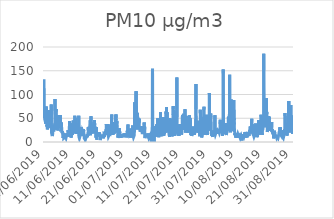
| Category | PM10 |
|---|---|
| 01/06/2019 | 132.3 |
| 01/06/2019 | 102.1 |
| 01/06/2019 | 87.3 |
| 01/06/2019 | 62.1 |
| 01/06/2019 | 53.3 |
| 01/06/2019 | 50.5 |
| 01/06/2019 | 57.1 |
| 01/06/2019 | 62.4 |
| 01/06/2019 | 73.5 |
| 01/06/2019 | 57.9 |
| 01/06/2019 | 46.1 |
| 01/06/2019 | 52.6 |
| 01/06/2019 | 38.8 |
| 01/06/2019 | 36.7 |
| 01/06/2019 | 43 |
| 01/06/2019 | 43.2 |
| 01/06/2019 | 40.1 |
| 01/06/2019 | 42.5 |
| 01/06/2019 | 53 |
| 01/06/2019 | 67.5 |
| 01/06/2019 | 74.9 |
| 01/06/2019 | 75 |
| 01/06/2019 | 54.7 |
| 01/06/2019 | 57.1 |
| 02/06/2019 | 43.9 |
| 02/06/2019 | 32.4 |
| 02/06/2019 | 31.8 |
| 02/06/2019 | 35.2 |
| 02/06/2019 | 31.3 |
| 02/06/2019 | 26.5 |
| 02/06/2019 | 27 |
| 02/06/2019 | 28.6 |
| 02/06/2019 | 30 |
| 02/06/2019 | 38.4 |
| 02/06/2019 | 37.2 |
| 02/06/2019 | 49.2 |
| 02/06/2019 | 38.3 |
| 02/06/2019 | 43.3 |
| 02/06/2019 | 54.2 |
| 02/06/2019 | 45.6 |
| 02/06/2019 | 55.1 |
| 02/06/2019 | 53.9 |
| 02/06/2019 | 50.5 |
| 02/06/2019 | 57.3 |
| 02/06/2019 | 67.3 |
| 02/06/2019 | 57.7 |
| 02/06/2019 | 51.8 |
| 02/06/2019 | 46.9 |
| 03/06/2019 | 37 |
| 03/06/2019 | 33.7 |
| 03/06/2019 | 33.9 |
| 03/06/2019 | 29.6 |
| 03/06/2019 | 28.3 |
| 03/06/2019 | 28.6 |
| 03/06/2019 | 37.1 |
| 03/06/2019 | 40.7 |
| 03/06/2019 | 50.6 |
| 03/06/2019 | 53.3 |
| 03/06/2019 | 55 |
| 03/06/2019 | 56.9 |
| 03/06/2019 | 66.3 |
| 03/06/2019 | 33.8 |
| 03/06/2019 | 40.7 |
| 03/06/2019 | 78.7 |
| 03/06/2019 | 42.7 |
| 03/06/2019 | 19.9 |
| 03/06/2019 | 18.2 |
| 03/06/2019 | 18.1 |
| 03/06/2019 | 17.1 |
| 03/06/2019 | 17 |
| 03/06/2019 | 18.9 |
| 03/06/2019 | 16.9 |
| 04/06/2019 | 15.3 |
| 04/06/2019 | 12.5 |
| 04/06/2019 | 12 |
| 04/06/2019 | 14.3 |
| 04/06/2019 | 17.2 |
| 04/06/2019 | 36.2 |
| 04/06/2019 | 38.3 |
| 04/06/2019 | 35 |
| 04/06/2019 | 35.5 |
| 04/06/2019 | 33.3 |
| 04/06/2019 | 27.3 |
| 04/06/2019 | 29.3 |
| 04/06/2019 | 31.8 |
| 04/06/2019 | 28.4 |
| 04/06/2019 | 22.4 |
| 04/06/2019 | 26.1 |
| 04/06/2019 | 26.2 |
| 04/06/2019 | 26.8 |
| 04/06/2019 | 25.8 |
| 04/06/2019 | 24.7 |
| 04/06/2019 | 35.4 |
| 04/06/2019 | 27.1 |
| 04/06/2019 | 31 |
| 04/06/2019 | 26.5 |
| 05/06/2019 | 40.7 |
| 05/06/2019 | 90.4 |
| 05/06/2019 | 58 |
| 05/06/2019 | 36.3 |
| 05/06/2019 | 39.2 |
| 05/06/2019 | 43.2 |
| 05/06/2019 | 50.3 |
| 05/06/2019 | 43.5 |
| 05/06/2019 | 43.4 |
| 05/06/2019 | 45.8 |
| 05/06/2019 | 47.2 |
| 05/06/2019 | 69.4 |
| 05/06/2019 | 63.5 |
| 05/06/2019 | 49.3 |
| 05/06/2019 | 56.3 |
| 05/06/2019 | 45.2 |
| 05/06/2019 | 35.7 |
| 05/06/2019 | 38 |
| 05/06/2019 | 29.9 |
| 05/06/2019 | 28 |
| 05/06/2019 | 26 |
| 05/06/2019 | 31 |
| 05/06/2019 | 32.5 |
| 05/06/2019 | 27.8 |
| 06/06/2019 | 24.3 |
| 06/06/2019 | 24.8 |
| 06/06/2019 | 24.2 |
| 06/06/2019 | 30.1 |
| 06/06/2019 | 33.2 |
| 06/06/2019 | 31.6 |
| 06/06/2019 | 37.3 |
| 06/06/2019 | 52 |
| 06/06/2019 | 45.5 |
| 06/06/2019 | 30.3 |
| 06/06/2019 | 31 |
| 06/06/2019 | 34.2 |
| 06/06/2019 | 37.7 |
| 06/06/2019 | 48.4 |
| 06/06/2019 | 56.7 |
| 06/06/2019 | 47.6 |
| 06/06/2019 | 43.7 |
| 06/06/2019 | 35.9 |
| 06/06/2019 | 32.2 |
| 06/06/2019 | 42 |
| 06/06/2019 | 43.3 |
| 06/06/2019 | 35 |
| 06/06/2019 | 34.3 |
| 06/06/2019 | 29.5 |
| 07/06/2019 | 30.8 |
| 07/06/2019 | 56.5 |
| 07/06/2019 | 36.3 |
| 07/06/2019 | 24.8 |
| 07/06/2019 | 22.4 |
| 07/06/2019 | 25.4 |
| 07/06/2019 | 33.3 |
| 07/06/2019 | 30.9 |
| 07/06/2019 | 36.4 |
| 07/06/2019 | 36.4 |
| 07/06/2019 | 41.2 |
| 07/06/2019 | 31.9 |
| 07/06/2019 | 27.1 |
| 07/06/2019 | 24.5 |
| 07/06/2019 | 22.8 |
| 07/06/2019 | 18.8 |
| 07/06/2019 | 18 |
| 07/06/2019 | 20.2 |
| 07/06/2019 | 22.6 |
| 07/06/2019 | 22.5 |
| 07/06/2019 | 20.7 |
| 07/06/2019 | 23 |
| 07/06/2019 | 16.8 |
| 07/06/2019 | 12.8 |
| 08/06/2019 | 8.5 |
| 08/06/2019 | 9 |
| 08/06/2019 | 8.9 |
| 08/06/2019 | 19.1 |
| 08/06/2019 | 13 |
| 08/06/2019 | 7.7 |
| 08/06/2019 | 8.3 |
| 08/06/2019 | 7.6 |
| 08/06/2019 | 6.8 |
| 08/06/2019 | 7.2 |
| 08/06/2019 | 7.3 |
| 08/06/2019 | 9.6 |
| 08/06/2019 | 9.1 |
| 08/06/2019 | 9.8 |
| 08/06/2019 | 9.6 |
| 08/06/2019 | 9.8 |
| 08/06/2019 | 12.3 |
| 08/06/2019 | 13.1 |
| 08/06/2019 | 12.4 |
| 08/06/2019 | 17.1 |
| 08/06/2019 | 14.7 |
| 08/06/2019 | 14.9 |
| 08/06/2019 | 11.5 |
| 08/06/2019 | 10.7 |
| 09/06/2019 | 11.3 |
| 09/06/2019 | 11.5 |
| 09/06/2019 | 8.9 |
| 09/06/2019 | 10 |
| 09/06/2019 | 10.2 |
| 09/06/2019 | 10 |
| 09/06/2019 | 13.3 |
| 09/06/2019 | 12.2 |
| 09/06/2019 | 14.1 |
| 09/06/2019 | 18.4 |
| 09/06/2019 | 16.4 |
| 09/06/2019 | 17.8 |
| 09/06/2019 | 13.7 |
| 09/06/2019 | 17.5 |
| 09/06/2019 | 16.2 |
| 09/06/2019 | 16 |
| 09/06/2019 | 15.8 |
| 09/06/2019 | 14 |
| 09/06/2019 | 14.4 |
| 09/06/2019 | 17.3 |
| 09/06/2019 | 24.9 |
| 09/06/2019 | 20.4 |
| 09/06/2019 | 21.6 |
| 09/06/2019 | 11.3 |
| 10/06/2019 | 10.7 |
| 10/06/2019 | 11.9 |
| 10/06/2019 | 12.6 |
| 10/06/2019 | 10.3 |
| 10/06/2019 | 9.8 |
| 10/06/2019 | 11.3 |
| 10/06/2019 | 19.6 |
| 10/06/2019 | 20.7 |
| 10/06/2019 | 19.3 |
| 10/06/2019 | 44 |
| 10/06/2019 | 22.8 |
| 10/06/2019 | 20.8 |
| 10/06/2019 | 18 |
| 10/06/2019 | 15.5 |
| 10/06/2019 | 19.8 |
| 10/06/2019 | 19.7 |
| 10/06/2019 | 16.6 |
| 10/06/2019 | 27.3 |
| 10/06/2019 | 26.1 |
| 10/06/2019 | 35.1 |
| 10/06/2019 | 30.2 |
| 10/06/2019 | 19.6 |
| 10/06/2019 | 16.5 |
| 10/06/2019 | 9.2 |
| 11/06/2019 | 13.5 |
| 11/06/2019 | 13.8 |
| 11/06/2019 | 14 |
| 11/06/2019 | 12.2 |
| 11/06/2019 | 14.5 |
| 11/06/2019 | 15.9 |
| 11/06/2019 | 20.1 |
| 11/06/2019 | 21.4 |
| 11/06/2019 | 29.1 |
| 11/06/2019 | 26.9 |
| 11/06/2019 | 39.3 |
| 11/06/2019 | 32.9 |
| 11/06/2019 | 15.4 |
| 11/06/2019 | 20.9 |
| 11/06/2019 | 23.8 |
| 11/06/2019 | 21.3 |
| 11/06/2019 | 36.8 |
| 11/06/2019 | 33.4 |
| 11/06/2019 | 45 |
| 11/06/2019 | 28.5 |
| 11/06/2019 | 39.6 |
| 11/06/2019 | 25.1 |
| 11/06/2019 | 18.9 |
| 11/06/2019 | 21.1 |
| 12/06/2019 | 21.9 |
| 12/06/2019 | 18.3 |
| 12/06/2019 | 17.6 |
| 12/06/2019 | 17.6 |
| 12/06/2019 | 17.4 |
| 12/06/2019 | 19.6 |
| 12/06/2019 | 28.5 |
| 12/06/2019 | 42.6 |
| 12/06/2019 | 55.1 |
| 12/06/2019 | 53.8 |
| 12/06/2019 | 39.5 |
| 12/06/2019 | 29.6 |
| 12/06/2019 | 34.4 |
| 12/06/2019 | 27.6 |
| 12/06/2019 | 36 |
| 12/06/2019 | 50.6 |
| 12/06/2019 | 27.9 |
| 12/06/2019 | 39.4 |
| 12/06/2019 | 35.1 |
| 12/06/2019 | 25.8 |
| 12/06/2019 | 30.4 |
| 12/06/2019 | 33.5 |
| 12/06/2019 | 28.5 |
| 12/06/2019 | 20 |
| 13/06/2019 | 16.9 |
| 13/06/2019 | 16.6 |
| 13/06/2019 | 23.1 |
| 13/06/2019 | 21.3 |
| 13/06/2019 | 23 |
| 13/06/2019 | 23 |
| 13/06/2019 | 25.5 |
| 13/06/2019 | 33.1 |
| 13/06/2019 | 33.2 |
| 13/06/2019 | 33.3 |
| 13/06/2019 | 29.4 |
| 13/06/2019 | 23.4 |
| 13/06/2019 | 23.8 |
| 13/06/2019 | 25.3 |
| 13/06/2019 | 23.1 |
| 13/06/2019 | 20.5 |
| 13/06/2019 | 22.3 |
| 13/06/2019 | 23.8 |
| 13/06/2019 | 30.2 |
| 13/06/2019 | 55.5 |
| 13/06/2019 | 12.3 |
| 13/06/2019 | 9.8 |
| 13/06/2019 | 10 |
| 13/06/2019 | 11.3 |
| 14/06/2019 | 7.6 |
| 14/06/2019 | 7.8 |
| 14/06/2019 | 7.9 |
| 14/06/2019 | 7.8 |
| 14/06/2019 | 10.6 |
| 14/06/2019 | 14 |
| 14/06/2019 | 16.1 |
| 14/06/2019 | 22.4 |
| 14/06/2019 | 12.6 |
| 14/06/2019 | 14.4 |
| 14/06/2019 | 15.4 |
| 14/06/2019 | 26.7 |
| 14/06/2019 | 27 |
| 14/06/2019 | 24.2 |
| 14/06/2019 | 29 |
| 14/06/2019 | 22.2 |
| 14/06/2019 | 25.5 |
| 14/06/2019 | 31.1 |
| 14/06/2019 | 13.8 |
| 14/06/2019 | 17.6 |
| 14/06/2019 | 14.6 |
| 14/06/2019 | 16.7 |
| 14/06/2019 | 16 |
| 14/06/2019 | 14.3 |
| 15/06/2019 | 16.8 |
| 15/06/2019 | 17.1 |
| 15/06/2019 | 17.8 |
| 15/06/2019 | 21.3 |
| 15/06/2019 | 23.9 |
| 15/06/2019 | 23.6 |
| 15/06/2019 | 22.2 |
| 15/06/2019 | 24.1 |
| 15/06/2019 | 23.8 |
| 15/06/2019 | 25.6 |
| 15/06/2019 | 22.8 |
| 15/06/2019 | 21.9 |
| 15/06/2019 | 19.8 |
| 15/06/2019 | 27.1 |
| 15/06/2019 | 23 |
| 15/06/2019 | 19.4 |
| 15/06/2019 | 16.9 |
| 15/06/2019 | 12.8 |
| 15/06/2019 | 10.5 |
| 15/06/2019 | 7.7 |
| 15/06/2019 | 7.1 |
| 15/06/2019 | 8.3 |
| 15/06/2019 | 7.9 |
| 15/06/2019 | 8.1 |
| 16/06/2019 | 7 |
| 16/06/2019 | 6.9 |
| 16/06/2019 | 6.1 |
| 16/06/2019 | 4.9 |
| 16/06/2019 | 4 |
| 16/06/2019 | 6 |
| 16/06/2019 | 9.4 |
| 16/06/2019 | 6.8 |
| 16/06/2019 | 8.7 |
| 16/06/2019 | 7.3 |
| 16/06/2019 | 8.4 |
| 16/06/2019 | 7.9 |
| 16/06/2019 | 8.5 |
| 16/06/2019 | 8.8 |
| 16/06/2019 | 10.2 |
| 16/06/2019 | 9.9 |
| 16/06/2019 | 10.9 |
| 16/06/2019 | 13.3 |
| 16/06/2019 | 12.3 |
| 16/06/2019 | 12.5 |
| 16/06/2019 | 13.9 |
| 16/06/2019 | 16.1 |
| 16/06/2019 | 17.8 |
| 16/06/2019 | 12.3 |
| 17/06/2019 | 10.1 |
| 17/06/2019 | 11.4 |
| 17/06/2019 | 16.1 |
| 17/06/2019 | 14.7 |
| 17/06/2019 | 13.7 |
| 17/06/2019 | 17.9 |
| 17/06/2019 | 31.1 |
| 17/06/2019 | 31.4 |
| 17/06/2019 | 22.5 |
| 17/06/2019 | 16.2 |
| 17/06/2019 | 15.7 |
| 17/06/2019 | 19.4 |
| 17/06/2019 | 26.9 |
| 17/06/2019 | 26.4 |
| 17/06/2019 | 23.7 |
| 17/06/2019 | 25.7 |
| 17/06/2019 | 32.1 |
| 17/06/2019 | 27 |
| 17/06/2019 | 22.7 |
| 17/06/2019 | 28 |
| 17/06/2019 | 28.7 |
| 17/06/2019 | 28.9 |
| 17/06/2019 | 33.1 |
| 17/06/2019 | 36.9 |
| 18/06/2019 | 45.8 |
| 18/06/2019 | 23.1 |
| 18/06/2019 | 14.4 |
| 18/06/2019 | 22.5 |
| 18/06/2019 | 18 |
| 18/06/2019 | 21.5 |
| 18/06/2019 | 41.1 |
| 18/06/2019 | 54.2 |
| 18/06/2019 | 37.9 |
| 18/06/2019 | 30.6 |
| 18/06/2019 | 26.9 |
| 18/06/2019 | 27.3 |
| 18/06/2019 | 27.6 |
| 18/06/2019 | 30.8 |
| 18/06/2019 | 32.2 |
| 18/06/2019 | 21.2 |
| 18/06/2019 | 20.9 |
| 18/06/2019 | 23.7 |
| 18/06/2019 | 26.2 |
| 18/06/2019 | 32.7 |
| 18/06/2019 | 36.6 |
| 18/06/2019 | 38.5 |
| 18/06/2019 | 28 |
| 18/06/2019 | 30.4 |
| 19/06/2019 | 26.3 |
| 19/06/2019 | 27.6 |
| 19/06/2019 | 20.4 |
| 19/06/2019 | 19.2 |
| 19/06/2019 | 18.9 |
| 19/06/2019 | 18.1 |
| 19/06/2019 | 27.8 |
| 19/06/2019 | 36.7 |
| 19/06/2019 | 29.3 |
| 19/06/2019 | 29.5 |
| 19/06/2019 | 38.7 |
| 19/06/2019 | 33.9 |
| 19/06/2019 | 35.2 |
| 19/06/2019 | 32.4 |
| 19/06/2019 | 46.1 |
| 19/06/2019 | 35.7 |
| 19/06/2019 | 31 |
| 19/06/2019 | 30.1 |
| 19/06/2019 | 26.1 |
| 19/06/2019 | 21.7 |
| 19/06/2019 | 22.4 |
| 19/06/2019 | 28.7 |
| 19/06/2019 | 31.9 |
| 19/06/2019 | 27 |
| 20/06/2019 | 14.9 |
| 20/06/2019 | 13.9 |
| 20/06/2019 | 11.4 |
| 20/06/2019 | 9 |
| 20/06/2019 | 11 |
| 20/06/2019 | 15.6 |
| 20/06/2019 | 31.3 |
| 20/06/2019 | 13.8 |
| 20/06/2019 | 8.5 |
| 20/06/2019 | 6.4 |
| 20/06/2019 | 4.8 |
| 20/06/2019 | 7 |
| 20/06/2019 | 8.6 |
| 20/06/2019 | 8.4 |
| 20/06/2019 | 11.7 |
| 20/06/2019 | 14.6 |
| 20/06/2019 | 14.6 |
| 20/06/2019 | 13.6 |
| 20/06/2019 | 16.1 |
| 20/06/2019 | 14.6 |
| 20/06/2019 | 14.4 |
| 20/06/2019 | 19.8 |
| 20/06/2019 | 14.4 |
| 20/06/2019 | 11.8 |
| 21/06/2019 | 9.8 |
| 21/06/2019 | 11.1 |
| 21/06/2019 | 12.1 |
| 21/06/2019 | 12 |
| 21/06/2019 | 19.7 |
| 21/06/2019 | 18.7 |
| 21/06/2019 | 16.7 |
| 21/06/2019 | 17.6 |
| 21/06/2019 | 14 |
| 21/06/2019 | 14.4 |
| 21/06/2019 | 19.9 |
| 21/06/2019 | 17.9 |
| 21/06/2019 | 15.1 |
| 21/06/2019 | 12.8 |
| 21/06/2019 | 14.7 |
| 21/06/2019 | 11.6 |
| 21/06/2019 | 9.9 |
| 21/06/2019 | 4 |
| 21/06/2019 | 5.1 |
| 21/06/2019 | 7.8 |
| 21/06/2019 | 12.5 |
| 21/06/2019 | 12.6 |
| 21/06/2019 | 9.9 |
| 21/06/2019 | 10.6 |
| 22/06/2019 | 10.1 |
| 22/06/2019 | 9.4 |
| 22/06/2019 | 10.6 |
| 22/06/2019 | 10.9 |
| 22/06/2019 | 9 |
| 22/06/2019 | 9.3 |
| 22/06/2019 | 8.5 |
| 22/06/2019 | 10.1 |
| 22/06/2019 | 9.1 |
| 22/06/2019 | 7.9 |
| 22/06/2019 | 10.6 |
| 22/06/2019 | 15.6 |
| 22/06/2019 | 11.5 |
| 22/06/2019 | 14.1 |
| 22/06/2019 | 14 |
| 22/06/2019 | 10.5 |
| 22/06/2019 | 12.2 |
| 22/06/2019 | 13.9 |
| 22/06/2019 | 11.6 |
| 22/06/2019 | 10.9 |
| 22/06/2019 | 8 |
| 22/06/2019 | 7.1 |
| 22/06/2019 | 8.7 |
| 22/06/2019 | 11.3 |
| 23/06/2019 | 14 |
| 23/06/2019 | 17.3 |
| 23/06/2019 | 17.4 |
| 23/06/2019 | 17.2 |
| 23/06/2019 | 18.7 |
| 23/06/2019 | 18.4 |
| 23/06/2019 | 17.9 |
| 23/06/2019 | 18.2 |
| 23/06/2019 | 16.7 |
| 23/06/2019 | 17 |
| 23/06/2019 | 15.5 |
| 23/06/2019 | 14.2 |
| 23/06/2019 | 15.6 |
| 23/06/2019 | 18.2 |
| 23/06/2019 | 18.7 |
| 23/06/2019 | 18.6 |
| 23/06/2019 | 23.4 |
| 23/06/2019 | 20.3 |
| 23/06/2019 | 18.1 |
| 23/06/2019 | 18.6 |
| 23/06/2019 | 26.8 |
| 23/06/2019 | 29.2 |
| 23/06/2019 | 37.4 |
| 23/06/2019 | 33.6 |
| 24/06/2019 | 35.8 |
| 24/06/2019 | 18.8 |
| 24/06/2019 | 15.1 |
| 24/06/2019 | 15.2 |
| 24/06/2019 | 16.1 |
| 24/06/2019 | 15.2 |
| 24/06/2019 | 20 |
| 24/06/2019 | 26.9 |
| 24/06/2019 | 26.5 |
| 24/06/2019 | 32.6 |
| 24/06/2019 | 22.9 |
| 24/06/2019 | 28.3 |
| 24/06/2019 | 24.5 |
| 24/06/2019 | 37.6 |
| 24/06/2019 | 17.9 |
| 24/06/2019 | 15.1 |
| 24/06/2019 | 13.6 |
| 24/06/2019 | 11.5 |
| 24/06/2019 | 10.1 |
| 24/06/2019 | 11.3 |
| 24/06/2019 | 11 |
| 24/06/2019 | 10.9 |
| 24/06/2019 | 11.9 |
| 24/06/2019 | 13.6 |
| 25/06/2019 | 15 |
| 25/06/2019 | 14.6 |
| 25/06/2019 | 14.3 |
| 25/06/2019 | 13 |
| 25/06/2019 | 12.6 |
| 25/06/2019 | 12.4 |
| 25/06/2019 | 13.7 |
| 25/06/2019 | 14.6 |
| 25/06/2019 | 21.3 |
| 25/06/2019 | 22 |
| 25/06/2019 | 20.1 |
| 25/06/2019 | 24.8 |
| 25/06/2019 | 20.4 |
| 25/06/2019 | 24.8 |
| 25/06/2019 | 34.9 |
| 25/06/2019 | 20.3 |
| 25/06/2019 | 18.3 |
| 25/06/2019 | 17.7 |
| 25/06/2019 | 26.5 |
| 25/06/2019 | 27.4 |
| 25/06/2019 | 36.4 |
| 25/06/2019 | 57.7 |
| 25/06/2019 | 45.5 |
| 25/06/2019 | 31 |
| 26/06/2019 | 34.3 |
| 26/06/2019 | 27.7 |
| 26/06/2019 | 14.8 |
| 26/06/2019 | 15.6 |
| 26/06/2019 | 25.7 |
| 26/06/2019 | 15 |
| 26/06/2019 | 21.3 |
| 26/06/2019 | 26.3 |
| 26/06/2019 | 35.4 |
| 26/06/2019 | 25.8 |
| 26/06/2019 | 19.6 |
| 26/06/2019 | 17.5 |
| 26/06/2019 | 19.2 |
| 26/06/2019 | 16 |
| 26/06/2019 | 17.6 |
| 26/06/2019 | 24.3 |
| 26/06/2019 | 19.9 |
| 26/06/2019 | 16.7 |
| 26/06/2019 | 23.2 |
| 26/06/2019 | 31.7 |
| 26/06/2019 | 35.9 |
| 26/06/2019 | 41.8 |
| 26/06/2019 | 37.2 |
| 26/06/2019 | 36.2 |
| 27/06/2019 | 30.5 |
| 27/06/2019 | 22.3 |
| 27/06/2019 | 23.9 |
| 27/06/2019 | 19.2 |
| 27/06/2019 | 24.4 |
| 27/06/2019 | 26.8 |
| 27/06/2019 | 31.4 |
| 27/06/2019 | 36.9 |
| 27/06/2019 | 55 |
| 27/06/2019 | 51 |
| 27/06/2019 | 52.5 |
| 27/06/2019 | 58 |
| 27/06/2019 | 57.7 |
| 27/06/2019 | 45.7 |
| 27/06/2019 | 43 |
| 27/06/2019 | 35.5 |
| 27/06/2019 | 29.7 |
| 27/06/2019 | 32.2 |
| 27/06/2019 | 35.3 |
| 27/06/2019 | 44.4 |
| 27/06/2019 | 38.9 |
| 27/06/2019 | 38.6 |
| 27/06/2019 | 33.6 |
| 27/06/2019 | 28.3 |
| 28/06/2019 | 24.6 |
| 28/06/2019 | 23 |
| 28/06/2019 | 20.9 |
| 28/06/2019 | 9.1 |
| 28/06/2019 | 10.9 |
| 28/06/2019 | 8.6 |
| 28/06/2019 | 9.2 |
| 28/06/2019 | 11.3 |
| 28/06/2019 | 15.3 |
| 28/06/2019 | 18.7 |
| 28/06/2019 | 14.5 |
| 28/06/2019 | 18 |
| 28/06/2019 | 19.7 |
| 28/06/2019 | 17.3 |
| 28/06/2019 | 25.3 |
| 28/06/2019 | 27.1 |
| 28/06/2019 | 29.4 |
| 28/06/2019 | 18.1 |
| 28/06/2019 | 15.9 |
| 28/06/2019 | 17.7 |
| 28/06/2019 | 21.9 |
| 28/06/2019 | 21 |
| 28/06/2019 | 16.9 |
| 28/06/2019 | 18.4 |
| 29/06/2019 | 14 |
| 29/06/2019 | 14.2 |
| 29/06/2019 | 15.8 |
| 29/06/2019 | 13.2 |
| 29/06/2019 | 9.6 |
| 29/06/2019 | 11.8 |
| 29/06/2019 | 9.7 |
| 29/06/2019 | 9.4 |
| 29/06/2019 | 11.5 |
| 29/06/2019 | 14.5 |
| 29/06/2019 | 16.8 |
| 29/06/2019 | 15.4 |
| 29/06/2019 | 14.7 |
| 29/06/2019 | 12 |
| 29/06/2019 | 12.7 |
| 29/06/2019 | 11 |
| 29/06/2019 | 10.3 |
| 29/06/2019 | 13 |
| 29/06/2019 | 13.4 |
| 29/06/2019 | 13.3 |
| 29/06/2019 | 10.9 |
| 29/06/2019 | 12 |
| 29/06/2019 | 12.4 |
| 29/06/2019 | 12.1 |
| 30/06/2019 | 16 |
| 30/06/2019 | 10.7 |
| 30/06/2019 | 11.1 |
| 30/06/2019 | 11.4 |
| 30/06/2019 | 11.2 |
| 30/06/2019 | 11.6 |
| 30/06/2019 | 10.2 |
| 30/06/2019 | 10.4 |
| 30/06/2019 | 17.2 |
| 30/06/2019 | 17.4 |
| 30/06/2019 | 18.6 |
| 30/06/2019 | 17.9 |
| 30/06/2019 | 13.6 |
| 30/06/2019 | 13.9 |
| 30/06/2019 | 12.1 |
| 30/06/2019 | 12.3 |
| 30/06/2019 | 17.6 |
| 30/06/2019 | 14.3 |
| 30/06/2019 | 14.9 |
| 30/06/2019 | 17.6 |
| 30/06/2019 | 14.7 |
| 30/06/2019 | 12.3 |
| 30/06/2019 | 12.9 |
| 30/06/2019 | 12.6 |
| 01/07/2019 | 13.5 |
| 01/07/2019 | 13.8 |
| 01/07/2019 | 14.1 |
| 01/07/2019 | 13.3 |
| 01/07/2019 | 11.3 |
| 01/07/2019 | 12.5 |
| 01/07/2019 | 12 |
| 01/07/2019 | 15.8 |
| 01/07/2019 | 17.8 |
| 01/07/2019 | 16.8 |
| 01/07/2019 | 16.1 |
| 01/07/2019 | 14.5 |
| 01/07/2019 | 16.5 |
| 01/07/2019 | 16.9 |
| 01/07/2019 | 18.6 |
| 01/07/2019 | 23.7 |
| 01/07/2019 | 20.6 |
| 01/07/2019 | 20.6 |
| 01/07/2019 | 21.9 |
| 01/07/2019 | 24.5 |
| 01/07/2019 | 30.9 |
| 01/07/2019 | 36.9 |
| 01/07/2019 | 13.2 |
| 01/07/2019 | 16 |
| 02/07/2019 | 15.6 |
| 02/07/2019 | 14.9 |
| 02/07/2019 | 14.6 |
| 02/07/2019 | 14 |
| 02/07/2019 | 16.2 |
| 02/07/2019 | 15.7 |
| 02/07/2019 | 16.4 |
| 02/07/2019 | 10.4 |
| 02/07/2019 | 14.8 |
| 02/07/2019 | 12.8 |
| 02/07/2019 | 14.5 |
| 02/07/2019 | 12.2 |
| 02/07/2019 | 11.8 |
| 02/07/2019 | 14 |
| 02/07/2019 | 13.9 |
| 02/07/2019 | 12.2 |
| 02/07/2019 | 12.3 |
| 02/07/2019 | 13.9 |
| 02/07/2019 | 12.2 |
| 02/07/2019 | 13 |
| 02/07/2019 | 13.6 |
| 02/07/2019 | 28.6 |
| 02/07/2019 | 26.7 |
| 02/07/2019 | 11 |
| 03/07/2019 | 13.3 |
| 03/07/2019 | 13.7 |
| 03/07/2019 | 11.9 |
| 03/07/2019 | 9.4 |
| 03/07/2019 | 9.9 |
| 03/07/2019 | 9.4 |
| 03/07/2019 | 13.1 |
| 03/07/2019 | 15.4 |
| 03/07/2019 | 18.6 |
| 03/07/2019 | 18.1 |
| 03/07/2019 | 15.7 |
| 03/07/2019 | 27.6 |
| 03/07/2019 | 22.7 |
| 03/07/2019 | 25.3 |
| 03/07/2019 | 34.9 |
| 03/07/2019 | 30.6 |
| 03/07/2019 | 29.5 |
| 03/07/2019 | 22.8 |
| 03/07/2019 | 14.2 |
| 03/07/2019 | 13.4 |
| 03/07/2019 | 12.4 |
| 03/07/2019 | 12.8 |
| 03/07/2019 | 10.1 |
| 03/07/2019 | 9.7 |
| 04/07/2019 | 10.4 |
| 04/07/2019 | 9.3 |
| 04/07/2019 | 11.4 |
| 04/07/2019 | 9.3 |
| 04/07/2019 | 10.2 |
| 04/07/2019 | 14.6 |
| 04/07/2019 | 22.4 |
| 04/07/2019 | 28.8 |
| 04/07/2019 | 30.5 |
| 04/07/2019 | 83.8 |
| 04/07/2019 | 31.2 |
| 04/07/2019 | 29.1 |
| 04/07/2019 | 31.7 |
| 04/07/2019 | 31.2 |
| 04/07/2019 | 35.6 |
| 04/07/2019 | 44.3 |
| 04/07/2019 | 38.6 |
| 04/07/2019 | 32.1 |
| 04/07/2019 | 39.2 |
| 04/07/2019 | 60.4 |
| 04/07/2019 | 29.3 |
| 04/07/2019 | 106.7 |
| 04/07/2019 | 34.8 |
| 04/07/2019 | 75.1 |
| 05/07/2019 | 74.8 |
| 05/07/2019 | 39.5 |
| 05/07/2019 | 54.3 |
| 05/07/2019 | 35.1 |
| 05/07/2019 | 61.6 |
| 05/07/2019 | 41.9 |
| 05/07/2019 | 26.1 |
| 05/07/2019 | 41.5 |
| 05/07/2019 | 42.8 |
| 05/07/2019 | 45.5 |
| 05/07/2019 | 61.1 |
| 05/07/2019 | 42.5 |
| 05/07/2019 | 42.7 |
| 05/07/2019 | 48.9 |
| 05/07/2019 | 47.8 |
| 05/07/2019 | 48.6 |
| 05/07/2019 | 42.3 |
| 05/07/2019 | 46.6 |
| 05/07/2019 | 42.3 |
| 05/07/2019 | 38.3 |
| 05/07/2019 | 49.2 |
| 05/07/2019 | 39.7 |
| 05/07/2019 | 40.8 |
| 05/07/2019 | 48.9 |
| 06/07/2019 | 46.7 |
| 06/07/2019 | 36.7 |
| 06/07/2019 | 33.3 |
| 06/07/2019 | 30 |
| 06/07/2019 | 28.6 |
| 06/07/2019 | 26.6 |
| 06/07/2019 | 30.5 |
| 06/07/2019 | 28 |
| 06/07/2019 | 29.7 |
| 06/07/2019 | 21.5 |
| 06/07/2019 | 21.2 |
| 06/07/2019 | 19.5 |
| 06/07/2019 | 23.4 |
| 06/07/2019 | 27.6 |
| 06/07/2019 | 32.6 |
| 06/07/2019 | 29.2 |
| 06/07/2019 | 33.3 |
| 06/07/2019 | 34.2 |
| 06/07/2019 | 32.1 |
| 06/07/2019 | 25.2 |
| 06/07/2019 | 31.5 |
| 06/07/2019 | 26.1 |
| 06/07/2019 | 29.5 |
| 06/07/2019 | 28.8 |
| 07/07/2019 | 26.5 |
| 07/07/2019 | 21.3 |
| 07/07/2019 | 22.4 |
| 07/07/2019 | 19.4 |
| 07/07/2019 | 16.6 |
| 07/07/2019 | 17.7 |
| 07/07/2019 | 18.5 |
| 07/07/2019 | 20.1 |
| 07/07/2019 | 22.5 |
| 07/07/2019 | 19.8 |
| 07/07/2019 | 24.7 |
| 07/07/2019 | 25.2 |
| 07/07/2019 | 29.3 |
| 07/07/2019 | 24.2 |
| 07/07/2019 | 24.6 |
| 07/07/2019 | 29.6 |
| 07/07/2019 | 26.2 |
| 07/07/2019 | 29.9 |
| 07/07/2019 | 28 |
| 07/07/2019 | 29.5 |
| 07/07/2019 | 41.2 |
| 07/07/2019 | 36 |
| 07/07/2019 | 30.1 |
| 07/07/2019 | 20.2 |
| 08/07/2019 | 33.9 |
| 08/07/2019 | 26.2 |
| 08/07/2019 | 10.7 |
| 08/07/2019 | 8.2 |
| 08/07/2019 | 8.7 |
| 08/07/2019 | 10.4 |
| 08/07/2019 | 12.5 |
| 08/07/2019 | 13.6 |
| 08/07/2019 | 11.6 |
| 08/07/2019 | 10.9 |
| 08/07/2019 | 12.7 |
| 08/07/2019 | 14.1 |
| 08/07/2019 | 13.5 |
| 08/07/2019 | 12.7 |
| 08/07/2019 | 12.9 |
| 08/07/2019 | 13.8 |
| 08/07/2019 | 17.7 |
| 08/07/2019 | 16 |
| 08/07/2019 | 14.1 |
| 08/07/2019 | 14.2 |
| 08/07/2019 | 15 |
| 08/07/2019 | 13.8 |
| 08/07/2019 | 14.1 |
| 08/07/2019 | 14.1 |
| 09/07/2019 | 14.6 |
| 09/07/2019 | 14.2 |
| 09/07/2019 | 13.3 |
| 09/07/2019 | 12.6 |
| 09/07/2019 | 13.1 |
| 09/07/2019 | 13.1 |
| 09/07/2019 | 15.8 |
| 09/07/2019 | 18 |
| 09/07/2019 | 17.5 |
| 09/07/2019 | 15.2 |
| 09/07/2019 | 8.1 |
| 09/07/2019 | 11.1 |
| 09/07/2019 | 10.9 |
| 09/07/2019 | 9.8 |
| 09/07/2019 | 8.1 |
| 09/07/2019 | 6.7 |
| 09/07/2019 | 6.4 |
| 09/07/2019 | 6.8 |
| 09/07/2019 | 8.2 |
| 09/07/2019 | 11.5 |
| 09/07/2019 | 12.5 |
| 09/07/2019 | 14.5 |
| 09/07/2019 | 17.3 |
| 09/07/2019 | 14.1 |
| 10/07/2019 | 10.2 |
| 10/07/2019 | 15 |
| 10/07/2019 | 17 |
| 10/07/2019 | 17 |
| 10/07/2019 | 15.3 |
| 10/07/2019 | 16.2 |
| 10/07/2019 | 16.1 |
| 10/07/2019 | 17.3 |
| 10/07/2019 | 18.1 |
| 10/07/2019 | 16.8 |
| 10/07/2019 | 15 |
| 10/07/2019 | 13.8 |
| 10/07/2019 | 13.8 |
| 10/07/2019 | 13.8 |
| 10/07/2019 | 0 |
| 10/07/2019 | 0 |
| 10/07/2019 | 0 |
| 10/07/2019 | 17.4 |
| 10/07/2019 | 18.5 |
| 10/07/2019 | 14.8 |
| 10/07/2019 | 31 |
| 10/07/2019 | 142.8 |
| 10/07/2019 | 154.1 |
| 10/07/2019 | 18.6 |
| 11/07/2019 | 17.3 |
| 11/07/2019 | 15 |
| 11/07/2019 | 16.7 |
| 11/07/2019 | 17.3 |
| 11/07/2019 | 14.5 |
| 11/07/2019 | 15.4 |
| 11/07/2019 | 16 |
| 11/07/2019 | 18.2 |
| 11/07/2019 | 22.9 |
| 11/07/2019 | 22.3 |
| 11/07/2019 | 25.5 |
| 11/07/2019 | 0 |
| 11/07/2019 | 23.9 |
| 11/07/2019 | 26.6 |
| 11/07/2019 | 25.6 |
| 11/07/2019 | 28.5 |
| 11/07/2019 | 25.9 |
| 11/07/2019 | 17.5 |
| 11/07/2019 | 24.1 |
| 11/07/2019 | 29.2 |
| 11/07/2019 | 19.7 |
| 11/07/2019 | 33.2 |
| 11/07/2019 | 24.6 |
| 11/07/2019 | 17.6 |
| 12/07/2019 | 14.4 |
| 12/07/2019 | 13.8 |
| 12/07/2019 | 11.4 |
| 12/07/2019 | 11.6 |
| 12/07/2019 | 15 |
| 12/07/2019 | 20.6 |
| 12/07/2019 | 23.4 |
| 12/07/2019 | 21.4 |
| 12/07/2019 | 28.8 |
| 12/07/2019 | 26.7 |
| 12/07/2019 | 36.8 |
| 12/07/2019 | 26.6 |
| 12/07/2019 | 34.7 |
| 12/07/2019 | 22.6 |
| 12/07/2019 | 25.4 |
| 12/07/2019 | 24.7 |
| 12/07/2019 | 36.4 |
| 12/07/2019 | 30.1 |
| 12/07/2019 | 23.5 |
| 12/07/2019 | 19.7 |
| 12/07/2019 | 50.1 |
| 12/07/2019 | 29.6 |
| 12/07/2019 | 20.1 |
| 12/07/2019 | 18.9 |
| 13/07/2019 | 14.7 |
| 13/07/2019 | 19 |
| 13/07/2019 | 17.5 |
| 13/07/2019 | 15.7 |
| 13/07/2019 | 14.6 |
| 13/07/2019 | 10 |
| 13/07/2019 | 24.6 |
| 13/07/2019 | 17.2 |
| 13/07/2019 | 21.3 |
| 13/07/2019 | 27.4 |
| 13/07/2019 | 20.8 |
| 13/07/2019 | 24.1 |
| 13/07/2019 | 21.4 |
| 13/07/2019 | 25.9 |
| 13/07/2019 | 19 |
| 13/07/2019 | 21.9 |
| 13/07/2019 | 27.8 |
| 13/07/2019 | 23.6 |
| 13/07/2019 | 18 |
| 13/07/2019 | 18 |
| 13/07/2019 | 31.5 |
| 13/07/2019 | 62.5 |
| 13/07/2019 | 33.3 |
| 13/07/2019 | 17.3 |
| 14/07/2019 | 21 |
| 14/07/2019 | 22.3 |
| 14/07/2019 | 18.5 |
| 14/07/2019 | 14.6 |
| 14/07/2019 | 17 |
| 14/07/2019 | 17.9 |
| 14/07/2019 | 18.1 |
| 14/07/2019 | 16.9 |
| 14/07/2019 | 12.2 |
| 14/07/2019 | 14.8 |
| 14/07/2019 | 14.4 |
| 14/07/2019 | 17.2 |
| 14/07/2019 | 12.6 |
| 14/07/2019 | 19.5 |
| 14/07/2019 | 36.1 |
| 14/07/2019 | 22.5 |
| 14/07/2019 | 14.8 |
| 14/07/2019 | 16.3 |
| 14/07/2019 | 13.9 |
| 14/07/2019 | 17.8 |
| 14/07/2019 | 36.6 |
| 14/07/2019 | 45 |
| 14/07/2019 | 52 |
| 14/07/2019 | 33.8 |
| 15/07/2019 | 16.6 |
| 15/07/2019 | 13.2 |
| 15/07/2019 | 11.7 |
| 15/07/2019 | 12 |
| 15/07/2019 | 14.8 |
| 15/07/2019 | 21.5 |
| 15/07/2019 | 17 |
| 15/07/2019 | 15.8 |
| 15/07/2019 | 19.4 |
| 15/07/2019 | 17.8 |
| 15/07/2019 | 19.5 |
| 15/07/2019 | 21.6 |
| 15/07/2019 | 19.6 |
| 15/07/2019 | 19.3 |
| 15/07/2019 | 17.4 |
| 15/07/2019 | 21.6 |
| 15/07/2019 | 24.1 |
| 15/07/2019 | 21.8 |
| 15/07/2019 | 25.8 |
| 15/07/2019 | 24.2 |
| 15/07/2019 | 34.2 |
| 15/07/2019 | 61.2 |
| 15/07/2019 | 64 |
| 15/07/2019 | 27.5 |
| 16/07/2019 | 33.2 |
| 16/07/2019 | 73.4 |
| 16/07/2019 | 51.8 |
| 16/07/2019 | 42.7 |
| 16/07/2019 | 33.3 |
| 16/07/2019 | 32.7 |
| 16/07/2019 | 43 |
| 16/07/2019 | 62.5 |
| 16/07/2019 | 37.8 |
| 16/07/2019 | 41.3 |
| 16/07/2019 | 31.6 |
| 16/07/2019 | 37.3 |
| 16/07/2019 | 25.5 |
| 16/07/2019 | 24.2 |
| 16/07/2019 | 38.5 |
| 16/07/2019 | 27.1 |
| 16/07/2019 | 20.5 |
| 16/07/2019 | 27.4 |
| 16/07/2019 | 44.7 |
| 16/07/2019 | 37.3 |
| 16/07/2019 | 34.7 |
| 16/07/2019 | 22 |
| 16/07/2019 | 19.5 |
| 16/07/2019 | 19.7 |
| 17/07/2019 | 15.3 |
| 17/07/2019 | 13.4 |
| 17/07/2019 | 14 |
| 17/07/2019 | 12.9 |
| 17/07/2019 | 10.5 |
| 17/07/2019 | 16.7 |
| 17/07/2019 | 15.5 |
| 17/07/2019 | 21.5 |
| 17/07/2019 | 30 |
| 17/07/2019 | 49.9 |
| 17/07/2019 | 49.1 |
| 17/07/2019 | 40 |
| 17/07/2019 | 34.2 |
| 17/07/2019 | 42.8 |
| 17/07/2019 | 47.2 |
| 17/07/2019 | 37.8 |
| 17/07/2019 | 46.9 |
| 17/07/2019 | 30.2 |
| 17/07/2019 | 31.8 |
| 17/07/2019 | 27.8 |
| 17/07/2019 | 29.1 |
| 17/07/2019 | 27.7 |
| 17/07/2019 | 26.5 |
| 17/07/2019 | 23.1 |
| 18/07/2019 | 17.4 |
| 18/07/2019 | 18.5 |
| 18/07/2019 | 14.3 |
| 18/07/2019 | 11.8 |
| 18/07/2019 | 14 |
| 18/07/2019 | 18.3 |
| 18/07/2019 | 18.5 |
| 18/07/2019 | 35 |
| 18/07/2019 | 35.1 |
| 18/07/2019 | 43.2 |
| 18/07/2019 | 50.9 |
| 18/07/2019 | 68.6 |
| 18/07/2019 | 75.6 |
| 18/07/2019 | 69.4 |
| 18/07/2019 | 57.2 |
| 18/07/2019 | 67.4 |
| 18/07/2019 | 45.1 |
| 18/07/2019 | 51.6 |
| 18/07/2019 | 44.1 |
| 18/07/2019 | 44.6 |
| 18/07/2019 | 65.8 |
| 18/07/2019 | 67.4 |
| 18/07/2019 | 22.3 |
| 18/07/2019 | 18.2 |
| 19/07/2019 | 12.8 |
| 19/07/2019 | 20.3 |
| 19/07/2019 | 22 |
| 19/07/2019 | 17 |
| 19/07/2019 | 17.8 |
| 19/07/2019 | 27.2 |
| 19/07/2019 | 28.8 |
| 19/07/2019 | 19 |
| 19/07/2019 | 26.1 |
| 19/07/2019 | 42.5 |
| 19/07/2019 | 48 |
| 19/07/2019 | 39.6 |
| 19/07/2019 | 37.2 |
| 19/07/2019 | 39.4 |
| 19/07/2019 | 37.1 |
| 19/07/2019 | 46.8 |
| 19/07/2019 | 51.6 |
| 19/07/2019 | 37.2 |
| 19/07/2019 | 38.8 |
| 19/07/2019 | 40.9 |
| 19/07/2019 | 44.2 |
| 19/07/2019 | 135.6 |
| 19/07/2019 | 52.4 |
| 19/07/2019 | 25.4 |
| 20/07/2019 | 18.6 |
| 20/07/2019 | 24.4 |
| 20/07/2019 | 26.8 |
| 20/07/2019 | 22.4 |
| 20/07/2019 | 19.9 |
| 20/07/2019 | 27.8 |
| 20/07/2019 | 28.9 |
| 20/07/2019 | 25.7 |
| 20/07/2019 | 13.9 |
| 20/07/2019 | 15 |
| 20/07/2019 | 18.4 |
| 20/07/2019 | 20.2 |
| 20/07/2019 | 16.2 |
| 20/07/2019 | 18.6 |
| 20/07/2019 | 23.6 |
| 20/07/2019 | 17.9 |
| 20/07/2019 | 12.8 |
| 20/07/2019 | 17.8 |
| 20/07/2019 | 18.7 |
| 20/07/2019 | 17.2 |
| 20/07/2019 | 22.2 |
| 20/07/2019 | 32.6 |
| 20/07/2019 | 37.8 |
| 20/07/2019 | 30.1 |
| 21/07/2019 | 19.4 |
| 21/07/2019 | 21.9 |
| 21/07/2019 | 22 |
| 21/07/2019 | 23.1 |
| 21/07/2019 | 20 |
| 21/07/2019 | 20.5 |
| 21/07/2019 | 21.1 |
| 21/07/2019 | 22.1 |
| 21/07/2019 | 29.9 |
| 21/07/2019 | 29.6 |
| 21/07/2019 | 26.1 |
| 21/07/2019 | 21.8 |
| 21/07/2019 | 17.9 |
| 21/07/2019 | 16.4 |
| 21/07/2019 | 15.6 |
| 21/07/2019 | 16.3 |
| 21/07/2019 | 15.8 |
| 21/07/2019 | 18.3 |
| 21/07/2019 | 19.1 |
| 21/07/2019 | 29.2 |
| 21/07/2019 | 43.5 |
| 21/07/2019 | 47.1 |
| 21/07/2019 | 57.2 |
| 21/07/2019 | 58.8 |
| 22/07/2019 | 51.8 |
| 22/07/2019 | 51.5 |
| 22/07/2019 | 52.2 |
| 22/07/2019 | 47.1 |
| 22/07/2019 | 32.2 |
| 22/07/2019 | 28.3 |
| 22/07/2019 | 31.8 |
| 22/07/2019 | 36.7 |
| 22/07/2019 | 42.6 |
| 22/07/2019 | 59.7 |
| 22/07/2019 | 41.6 |
| 22/07/2019 | 43.1 |
| 22/07/2019 | 36.1 |
| 22/07/2019 | 33.3 |
| 22/07/2019 | 26.1 |
| 22/07/2019 | 33.4 |
| 22/07/2019 | 26 |
| 22/07/2019 | 29.7 |
| 22/07/2019 | 33.8 |
| 22/07/2019 | 48.8 |
| 22/07/2019 | 53.2 |
| 22/07/2019 | 68.9 |
| 22/07/2019 | 50.6 |
| 22/07/2019 | 33.5 |
| 23/07/2019 | 35.8 |
| 23/07/2019 | 28.7 |
| 23/07/2019 | 21 |
| 23/07/2019 | 24.7 |
| 23/07/2019 | 19.8 |
| 23/07/2019 | 20.4 |
| 23/07/2019 | 33.5 |
| 23/07/2019 | 48.8 |
| 23/07/2019 | 55 |
| 23/07/2019 | 32 |
| 23/07/2019 | 28.4 |
| 23/07/2019 | 34.8 |
| 23/07/2019 | 22.6 |
| 23/07/2019 | 27.1 |
| 23/07/2019 | 25 |
| 23/07/2019 | 26.9 |
| 23/07/2019 | 29.8 |
| 23/07/2019 | 29.2 |
| 23/07/2019 | 30.8 |
| 23/07/2019 | 46.8 |
| 23/07/2019 | 35.8 |
| 23/07/2019 | 38.4 |
| 23/07/2019 | 22.8 |
| 23/07/2019 | 19.5 |
| 24/07/2019 | 18.8 |
| 24/07/2019 | 18.7 |
| 24/07/2019 | 18.3 |
| 24/07/2019 | 19 |
| 24/07/2019 | 19.7 |
| 24/07/2019 | 20.5 |
| 24/07/2019 | 30.3 |
| 24/07/2019 | 26.7 |
| 24/07/2019 | 32.9 |
| 24/07/2019 | 43.2 |
| 24/07/2019 | 37.6 |
| 24/07/2019 | 36.4 |
| 24/07/2019 | 51.9 |
| 24/07/2019 | 56.1 |
| 24/07/2019 | 57.9 |
| 24/07/2019 | 42 |
| 24/07/2019 | 38.1 |
| 24/07/2019 | 45.5 |
| 24/07/2019 | 46.4 |
| 24/07/2019 | 49.7 |
| 24/07/2019 | 47.8 |
| 24/07/2019 | 43.5 |
| 24/07/2019 | 29.7 |
| 24/07/2019 | 28 |
| 25/07/2019 | 14.5 |
| 25/07/2019 | 14.7 |
| 25/07/2019 | 16.4 |
| 25/07/2019 | 21.9 |
| 25/07/2019 | 26.2 |
| 25/07/2019 | 23 |
| 25/07/2019 | 18.1 |
| 25/07/2019 | 16.2 |
| 25/07/2019 | 12.7 |
| 25/07/2019 | 11.6 |
| 25/07/2019 | 15.2 |
| 25/07/2019 | 21.6 |
| 25/07/2019 | 19.4 |
| 25/07/2019 | 23.8 |
| 25/07/2019 | 25.7 |
| 25/07/2019 | 23.3 |
| 25/07/2019 | 24.8 |
| 25/07/2019 | 23.5 |
| 25/07/2019 | 29.1 |
| 25/07/2019 | 32.7 |
| 25/07/2019 | 31.9 |
| 25/07/2019 | 20 |
| 25/07/2019 | 20.9 |
| 25/07/2019 | 22.8 |
| 26/07/2019 | 20 |
| 26/07/2019 | 21 |
| 26/07/2019 | 15.6 |
| 26/07/2019 | 14 |
| 26/07/2019 | 17.3 |
| 26/07/2019 | 19.8 |
| 26/07/2019 | 15.1 |
| 26/07/2019 | 13 |
| 26/07/2019 | 18.6 |
| 26/07/2019 | 15.2 |
| 26/07/2019 | 17.4 |
| 26/07/2019 | 19.2 |
| 26/07/2019 | 18.2 |
| 26/07/2019 | 20.9 |
| 26/07/2019 | 22.1 |
| 26/07/2019 | 23.1 |
| 26/07/2019 | 25.5 |
| 26/07/2019 | 21.1 |
| 26/07/2019 | 20.3 |
| 26/07/2019 | 20.3 |
| 26/07/2019 | 48.2 |
| 26/07/2019 | 122.2 |
| 26/07/2019 | 69.5 |
| 26/07/2019 | 57.2 |
| 27/07/2019 | 40.1 |
| 27/07/2019 | 38 |
| 27/07/2019 | 35.5 |
| 27/07/2019 | 38.1 |
| 27/07/2019 | 28.8 |
| 27/07/2019 | 21.4 |
| 27/07/2019 | 28.8 |
| 27/07/2019 | 25.4 |
| 27/07/2019 | 27.8 |
| 27/07/2019 | 20 |
| 27/07/2019 | 20.8 |
| 27/07/2019 | 19.5 |
| 27/07/2019 | 19.5 |
| 27/07/2019 | 20.2 |
| 27/07/2019 | 19.3 |
| 27/07/2019 | 19.5 |
| 27/07/2019 | 24.3 |
| 27/07/2019 | 28.8 |
| 27/07/2019 | 40.2 |
| 27/07/2019 | 32.1 |
| 27/07/2019 | 41.5 |
| 27/07/2019 | 44.6 |
| 27/07/2019 | 32.6 |
| 27/07/2019 | 28.1 |
| 28/07/2019 | 22.2 |
| 28/07/2019 | 22.8 |
| 28/07/2019 | 29.8 |
| 28/07/2019 | 27.7 |
| 28/07/2019 | 24.2 |
| 28/07/2019 | 16.9 |
| 28/07/2019 | 17.9 |
| 28/07/2019 | 17 |
| 28/07/2019 | 12.2 |
| 28/07/2019 | 17.1 |
| 28/07/2019 | 19 |
| 28/07/2019 | 39 |
| 28/07/2019 | 68 |
| 28/07/2019 | 56.6 |
| 28/07/2019 | 43.7 |
| 28/07/2019 | 32.8 |
| 28/07/2019 | 29 |
| 28/07/2019 | 22.4 |
| 28/07/2019 | 23.3 |
| 28/07/2019 | 19.5 |
| 28/07/2019 | 19.9 |
| 28/07/2019 | 15.5 |
| 28/07/2019 | 12.9 |
| 28/07/2019 | 11.1 |
| 29/07/2019 | 9.5 |
| 29/07/2019 | 8.7 |
| 29/07/2019 | 8 |
| 29/07/2019 | 8.3 |
| 29/07/2019 | 7.8 |
| 29/07/2019 | 14.3 |
| 29/07/2019 | 12.3 |
| 29/07/2019 | 13.9 |
| 29/07/2019 | 16.8 |
| 29/07/2019 | 16.5 |
| 29/07/2019 | 20.9 |
| 29/07/2019 | 18.4 |
| 29/07/2019 | 20.2 |
| 29/07/2019 | 22.4 |
| 29/07/2019 | 24.4 |
| 29/07/2019 | 36.1 |
| 29/07/2019 | 47.2 |
| 29/07/2019 | 52.7 |
| 29/07/2019 | 55.5 |
| 29/07/2019 | 56.2 |
| 29/07/2019 | 74.2 |
| 29/07/2019 | 67.6 |
| 29/07/2019 | 50.6 |
| 29/07/2019 | 51.7 |
| 30/07/2019 | 31 |
| 30/07/2019 | 20 |
| 30/07/2019 | 18.9 |
| 30/07/2019 | 23.3 |
| 30/07/2019 | 15.2 |
| 30/07/2019 | 15.6 |
| 30/07/2019 | 24.2 |
| 30/07/2019 | 35.7 |
| 30/07/2019 | 39.8 |
| 30/07/2019 | 28.1 |
| 30/07/2019 | 28.3 |
| 30/07/2019 | 27.6 |
| 30/07/2019 | 28.8 |
| 30/07/2019 | 28.8 |
| 30/07/2019 | 29.8 |
| 30/07/2019 | 26.4 |
| 30/07/2019 | 30.9 |
| 30/07/2019 | 33.2 |
| 30/07/2019 | 43 |
| 30/07/2019 | 57.3 |
| 30/07/2019 | 35.4 |
| 30/07/2019 | 42.4 |
| 30/07/2019 | 33.8 |
| 30/07/2019 | 31.1 |
| 31/07/2019 | 30.5 |
| 31/07/2019 | 19.8 |
| 31/07/2019 | 18.6 |
| 31/07/2019 | 18.5 |
| 31/07/2019 | 14.8 |
| 31/07/2019 | 17.9 |
| 31/07/2019 | 23.4 |
| 31/07/2019 | 33.3 |
| 31/07/2019 | 25.2 |
| 31/07/2019 | 31 |
| 31/07/2019 | 26.5 |
| 31/07/2019 | 33.2 |
| 31/07/2019 | 44.5 |
| 31/07/2019 | 51.2 |
| 31/07/2019 | 34.7 |
| 31/07/2019 | 28.2 |
| 31/07/2019 | 28.8 |
| 31/07/2019 | 45.3 |
| 31/07/2019 | 48.9 |
| 31/07/2019 | 70.3 |
| 31/07/2019 | 103.1 |
| 31/07/2019 | 90.4 |
| 31/07/2019 | 60.8 |
| 31/07/2019 | 54.6 |
| 01/08/2019 | 40.7 |
| 01/08/2019 | 44.8 |
| 01/08/2019 | 36.5 |
| 01/08/2019 | 31.3 |
| 01/08/2019 | 23.9 |
| 01/08/2019 | 25.4 |
| 01/08/2019 | 36.6 |
| 01/08/2019 | 38.4 |
| 01/08/2019 | 59.9 |
| 01/08/2019 | 58 |
| 01/08/2019 | 52.8 |
| 01/08/2019 | 51 |
| 01/08/2019 | 39.9 |
| 01/08/2019 | 38.7 |
| 01/08/2019 | 38.5 |
| 01/08/2019 | 13.1 |
| 01/08/2019 | 15 |
| 01/08/2019 | 13.5 |
| 01/08/2019 | 13.6 |
| 01/08/2019 | 14 |
| 01/08/2019 | 18 |
| 01/08/2019 | 17.3 |
| 01/08/2019 | 13.2 |
| 01/08/2019 | 14.4 |
| 02/08/2019 | 13.6 |
| 02/08/2019 | 10.9 |
| 02/08/2019 | 9.9 |
| 02/08/2019 | 11.5 |
| 02/08/2019 | 12.2 |
| 02/08/2019 | 12.5 |
| 02/08/2019 | 16.5 |
| 02/08/2019 | 16.5 |
| 02/08/2019 | 18.3 |
| 02/08/2019 | 24.2 |
| 02/08/2019 | 21.8 |
| 02/08/2019 | 19.5 |
| 02/08/2019 | 13.7 |
| 02/08/2019 | 15.2 |
| 02/08/2019 | 16.4 |
| 02/08/2019 | 15.3 |
| 02/08/2019 | 18 |
| 02/08/2019 | 17.7 |
| 02/08/2019 | 19.2 |
| 02/08/2019 | 25.6 |
| 02/08/2019 | 53 |
| 02/08/2019 | 56.4 |
| 02/08/2019 | 22.4 |
| 02/08/2019 | 18.1 |
| 03/08/2019 | 20 |
| 03/08/2019 | 15.8 |
| 03/08/2019 | 15.2 |
| 03/08/2019 | 13.9 |
| 03/08/2019 | 14.8 |
| 03/08/2019 | 18.6 |
| 03/08/2019 | 19.4 |
| 03/08/2019 | 17.6 |
| 03/08/2019 | 18.1 |
| 03/08/2019 | 22.7 |
| 03/08/2019 | 22 |
| 03/08/2019 | 20.6 |
| 03/08/2019 | 23.2 |
| 03/08/2019 | 28.5 |
| 03/08/2019 | 26.3 |
| 03/08/2019 | 18.7 |
| 03/08/2019 | 22.3 |
| 03/08/2019 | 20.5 |
| 03/08/2019 | 26.8 |
| 03/08/2019 | 17.7 |
| 03/08/2019 | 17 |
| 03/08/2019 | 17.5 |
| 03/08/2019 | 16.6 |
| 03/08/2019 | 21.5 |
| 04/08/2019 | 21.9 |
| 04/08/2019 | 20.2 |
| 04/08/2019 | 20 |
| 04/08/2019 | 20.1 |
| 04/08/2019 | 18.4 |
| 04/08/2019 | 22.3 |
| 04/08/2019 | 23.5 |
| 04/08/2019 | 22.1 |
| 04/08/2019 | 18.6 |
| 04/08/2019 | 21.8 |
| 04/08/2019 | 22.6 |
| 04/08/2019 | 22.7 |
| 04/08/2019 | 19.5 |
| 04/08/2019 | 21.5 |
| 04/08/2019 | 18.4 |
| 04/08/2019 | 19.7 |
| 04/08/2019 | 22.7 |
| 04/08/2019 | 27.7 |
| 04/08/2019 | 26.5 |
| 04/08/2019 | 42.2 |
| 04/08/2019 | 46.9 |
| 04/08/2019 | 38.9 |
| 04/08/2019 | 41.9 |
| 04/08/2019 | 31.7 |
| 05/08/2019 | 25.7 |
| 05/08/2019 | 25 |
| 05/08/2019 | 25.5 |
| 05/08/2019 | 22.8 |
| 05/08/2019 | 19.1 |
| 05/08/2019 | 21.8 |
| 05/08/2019 | 24.8 |
| 05/08/2019 | 22.4 |
| 05/08/2019 | 21.4 |
| 05/08/2019 | 20.4 |
| 05/08/2019 | 24.8 |
| 05/08/2019 | 22.1 |
| 05/08/2019 | 19.5 |
| 05/08/2019 | 17.8 |
| 05/08/2019 | 16.7 |
| 05/08/2019 | 13 |
| 05/08/2019 | 13.5 |
| 05/08/2019 | 12.2 |
| 05/08/2019 | 14.1 |
| 05/08/2019 | 22.7 |
| 05/08/2019 | 33.4 |
| 05/08/2019 | 47.8 |
| 05/08/2019 | 152.7 |
| 05/08/2019 | 144.5 |
| 06/08/2019 | 78.6 |
| 06/08/2019 | 49.1 |
| 06/08/2019 | 23.6 |
| 06/08/2019 | 16.2 |
| 06/08/2019 | 17 |
| 06/08/2019 | 24.9 |
| 06/08/2019 | 34.7 |
| 06/08/2019 | 32 |
| 06/08/2019 | 32.2 |
| 06/08/2019 | 36.9 |
| 06/08/2019 | 37.7 |
| 06/08/2019 | 32.3 |
| 06/08/2019 | 34.1 |
| 06/08/2019 | 34 |
| 06/08/2019 | 30.7 |
| 06/08/2019 | 28.4 |
| 06/08/2019 | 27 |
| 06/08/2019 | 30.7 |
| 06/08/2019 | 26.9 |
| 06/08/2019 | 25.5 |
| 06/08/2019 | 28.6 |
| 06/08/2019 | 33.8 |
| 06/08/2019 | 40 |
| 06/08/2019 | 33.9 |
| 07/08/2019 | 21.5 |
| 07/08/2019 | 18.7 |
| 07/08/2019 | 17 |
| 07/08/2019 | 14.6 |
| 07/08/2019 | 12.5 |
| 07/08/2019 | 13 |
| 07/08/2019 | 12.8 |
| 07/08/2019 | 25.2 |
| 07/08/2019 | 36.2 |
| 07/08/2019 | 34.1 |
| 07/08/2019 | 30 |
| 07/08/2019 | 24.2 |
| 07/08/2019 | 22.1 |
| 07/08/2019 | 24.8 |
| 07/08/2019 | 25.8 |
| 07/08/2019 | 25.1 |
| 07/08/2019 | 24.2 |
| 07/08/2019 | 23.6 |
| 07/08/2019 | 22.2 |
| 07/08/2019 | 30.9 |
| 07/08/2019 | 53.4 |
| 07/08/2019 | 41.6 |
| 07/08/2019 | 41.8 |
| 07/08/2019 | 45.4 |
| 08/08/2019 | 41.7 |
| 08/08/2019 | 52.6 |
| 08/08/2019 | 48.4 |
| 08/08/2019 | 51.3 |
| 08/08/2019 | 51.2 |
| 08/08/2019 | 50.8 |
| 08/08/2019 | 63.6 |
| 08/08/2019 | 141.4 |
| 08/08/2019 | 80.7 |
| 08/08/2019 | 62.4 |
| 08/08/2019 | 33.1 |
| 08/08/2019 | 29.4 |
| 08/08/2019 | 29.5 |
| 08/08/2019 | 20.3 |
| 08/08/2019 | 28.8 |
| 08/08/2019 | 32.3 |
| 08/08/2019 | 29.6 |
| 08/08/2019 | 33.1 |
| 08/08/2019 | 38 |
| 08/08/2019 | 56.2 |
| 08/08/2019 | 61.8 |
| 08/08/2019 | 77.2 |
| 08/08/2019 | 89.5 |
| 08/08/2019 | 68.1 |
| 09/08/2019 | 63.8 |
| 09/08/2019 | 54.6 |
| 09/08/2019 | 37.3 |
| 09/08/2019 | 39.1 |
| 09/08/2019 | 30.9 |
| 09/08/2019 | 35.4 |
| 09/08/2019 | 29.8 |
| 09/08/2019 | 50.1 |
| 09/08/2019 | 48.7 |
| 09/08/2019 | 51.6 |
| 09/08/2019 | 37.8 |
| 09/08/2019 | 33 |
| 09/08/2019 | 35.7 |
| 09/08/2019 | 29.6 |
| 09/08/2019 | 29.6 |
| 09/08/2019 | 25.4 |
| 09/08/2019 | 25.2 |
| 09/08/2019 | 24.9 |
| 09/08/2019 | 22.9 |
| 09/08/2019 | 45.8 |
| 09/08/2019 | 88.4 |
| 09/08/2019 | 46.5 |
| 09/08/2019 | 50.2 |
| 09/08/2019 | 36.8 |
| 10/08/2019 | 35.7 |
| 10/08/2019 | 25.8 |
| 10/08/2019 | 28 |
| 10/08/2019 | 21.7 |
| 10/08/2019 | 20.7 |
| 10/08/2019 | 15.3 |
| 10/08/2019 | 18.2 |
| 10/08/2019 | 15.1 |
| 10/08/2019 | 15.8 |
| 10/08/2019 | 13.8 |
| 10/08/2019 | 12.9 |
| 10/08/2019 | 12.6 |
| 10/08/2019 | 12.5 |
| 10/08/2019 | 10.9 |
| 10/08/2019 | 8.8 |
| 10/08/2019 | 7.7 |
| 10/08/2019 | 10.3 |
| 10/08/2019 | 12.1 |
| 10/08/2019 | 10.2 |
| 10/08/2019 | 11.7 |
| 10/08/2019 | 14.2 |
| 10/08/2019 | 17.8 |
| 10/08/2019 | 17.7 |
| 10/08/2019 | 14.8 |
| 11/08/2019 | 12.9 |
| 11/08/2019 | 8.5 |
| 11/08/2019 | 11.8 |
| 11/08/2019 | 13.6 |
| 11/08/2019 | 14.6 |
| 11/08/2019 | 16.5 |
| 11/08/2019 | 16.3 |
| 11/08/2019 | 17 |
| 11/08/2019 | 18.4 |
| 11/08/2019 | 18.1 |
| 11/08/2019 | 17.3 |
| 11/08/2019 | 16.3 |
| 11/08/2019 | 13.5 |
| 11/08/2019 | 14.2 |
| 11/08/2019 | 12.9 |
| 11/08/2019 | 11.6 |
| 11/08/2019 | 11.8 |
| 11/08/2019 | 12.8 |
| 11/08/2019 | 11.9 |
| 11/08/2019 | 13.2 |
| 11/08/2019 | 13.3 |
| 11/08/2019 | 15.1 |
| 11/08/2019 | 14.4 |
| 11/08/2019 | 12 |
| 12/08/2019 | 11.7 |
| 12/08/2019 | 12.5 |
| 12/08/2019 | 11.2 |
| 12/08/2019 | 9.9 |
| 12/08/2019 | 10.4 |
| 12/08/2019 | 8 |
| 12/08/2019 | 7.6 |
| 12/08/2019 | 8 |
| 12/08/2019 | 9.2 |
| 12/08/2019 | 8.2 |
| 12/08/2019 | 7.8 |
| 12/08/2019 | 11.6 |
| 12/08/2019 | 9.5 |
| 12/08/2019 | 9.8 |
| 12/08/2019 | 7.4 |
| 12/08/2019 | 5.7 |
| 12/08/2019 | 7.9 |
| 12/08/2019 | 8.3 |
| 12/08/2019 | 7 |
| 12/08/2019 | 3.3 |
| 12/08/2019 | 2.8 |
| 12/08/2019 | 4.4 |
| 12/08/2019 | 6.6 |
| 12/08/2019 | 7.4 |
| 13/08/2019 | 8.1 |
| 13/08/2019 | 7.9 |
| 13/08/2019 | 10.8 |
| 13/08/2019 | 12.4 |
| 13/08/2019 | 16.6 |
| 13/08/2019 | 17.8 |
| 13/08/2019 | 15.3 |
| 13/08/2019 | 13.7 |
| 13/08/2019 | 12.6 |
| 13/08/2019 | 12.8 |
| 13/08/2019 | 14 |
| 13/08/2019 | 12.1 |
| 13/08/2019 | 11.7 |
| 13/08/2019 | 10.8 |
| 13/08/2019 | 9.2 |
| 13/08/2019 | 10.8 |
| 13/08/2019 | 10.5 |
| 13/08/2019 | 10.9 |
| 13/08/2019 | 12.1 |
| 13/08/2019 | 11.9 |
| 13/08/2019 | 16.4 |
| 13/08/2019 | 20.5 |
| 13/08/2019 | 16.5 |
| 13/08/2019 | 14.7 |
| 14/08/2019 | 13.4 |
| 14/08/2019 | 9.6 |
| 14/08/2019 | 9.2 |
| 14/08/2019 | 9.9 |
| 14/08/2019 | 11.1 |
| 14/08/2019 | 12.5 |
| 14/08/2019 | 16.2 |
| 14/08/2019 | 21.3 |
| 14/08/2019 | 16.6 |
| 14/08/2019 | 17.2 |
| 14/08/2019 | 19.4 |
| 14/08/2019 | 15.9 |
| 14/08/2019 | 14.7 |
| 14/08/2019 | 20.1 |
| 14/08/2019 | 15.6 |
| 14/08/2019 | 13.7 |
| 14/08/2019 | 11.9 |
| 14/08/2019 | 9.5 |
| 14/08/2019 | 17.5 |
| 14/08/2019 | 13.6 |
| 14/08/2019 | 11.7 |
| 14/08/2019 | 13.8 |
| 14/08/2019 | 17.4 |
| 14/08/2019 | 12.1 |
| 15/08/2019 | 16.6 |
| 15/08/2019 | 14.9 |
| 15/08/2019 | 13.5 |
| 15/08/2019 | 14.5 |
| 15/08/2019 | 12.8 |
| 15/08/2019 | 14.9 |
| 15/08/2019 | 16 |
| 15/08/2019 | 18.2 |
| 15/08/2019 | 17.8 |
| 15/08/2019 | 13 |
| 15/08/2019 | 14 |
| 15/08/2019 | 13 |
| 15/08/2019 | 19.5 |
| 15/08/2019 | 18.9 |
| 15/08/2019 | 18.1 |
| 15/08/2019 | 20 |
| 15/08/2019 | 20 |
| 15/08/2019 | 25.1 |
| 15/08/2019 | 23.9 |
| 15/08/2019 | 19.5 |
| 15/08/2019 | 25.6 |
| 15/08/2019 | 32.7 |
| 15/08/2019 | 18.2 |
| 15/08/2019 | 20 |
| 16/08/2019 | 17.8 |
| 16/08/2019 | 20 |
| 16/08/2019 | 21.9 |
| 16/08/2019 | 22.5 |
| 16/08/2019 | 19.9 |
| 16/08/2019 | 30.1 |
| 16/08/2019 | 31.3 |
| 16/08/2019 | 29.9 |
| 16/08/2019 | 32.8 |
| 16/08/2019 | 40.5 |
| 16/08/2019 | 49.1 |
| 16/08/2019 | 50.8 |
| 16/08/2019 | 26.3 |
| 16/08/2019 | 29.9 |
| 16/08/2019 | 26.4 |
| 16/08/2019 | 27.1 |
| 16/08/2019 | 29.3 |
| 16/08/2019 | 30.1 |
| 16/08/2019 | 34.2 |
| 16/08/2019 | 37.1 |
| 16/08/2019 | 34.3 |
| 16/08/2019 | 24.3 |
| 16/08/2019 | 17.9 |
| 16/08/2019 | 17.2 |
| 17/08/2019 | 14.2 |
| 17/08/2019 | 16.8 |
| 17/08/2019 | 14.6 |
| 17/08/2019 | 13 |
| 17/08/2019 | 12.5 |
| 17/08/2019 | 12.9 |
| 17/08/2019 | 11.3 |
| 17/08/2019 | 11.1 |
| 17/08/2019 | 10 |
| 17/08/2019 | 10.8 |
| 17/08/2019 | 9.2 |
| 17/08/2019 | 10.9 |
| 17/08/2019 | 11.9 |
| 17/08/2019 | 11.9 |
| 17/08/2019 | 16.8 |
| 17/08/2019 | 20.3 |
| 17/08/2019 | 22.9 |
| 17/08/2019 | 23.7 |
| 17/08/2019 | 22 |
| 17/08/2019 | 23.3 |
| 17/08/2019 | 32.1 |
| 17/08/2019 | 31.4 |
| 17/08/2019 | 39.1 |
| 17/08/2019 | 20.9 |
| 18/08/2019 | 13.6 |
| 18/08/2019 | 10.3 |
| 18/08/2019 | 8.5 |
| 18/08/2019 | 9.7 |
| 18/08/2019 | 8.8 |
| 18/08/2019 | 10 |
| 18/08/2019 | 8.4 |
| 18/08/2019 | 8.6 |
| 18/08/2019 | 14.6 |
| 18/08/2019 | 14 |
| 18/08/2019 | 10.7 |
| 18/08/2019 | 11.6 |
| 18/08/2019 | 12.6 |
| 18/08/2019 | 12.6 |
| 18/08/2019 | 13.9 |
| 18/08/2019 | 13.8 |
| 18/08/2019 | 13.1 |
| 18/08/2019 | 13.5 |
| 18/08/2019 | 21.1 |
| 18/08/2019 | 24 |
| 18/08/2019 | 23.1 |
| 18/08/2019 | 29.5 |
| 18/08/2019 | 23.4 |
| 18/08/2019 | 45.7 |
| 19/08/2019 | 36.7 |
| 19/08/2019 | 24.4 |
| 19/08/2019 | 21.8 |
| 19/08/2019 | 18.5 |
| 19/08/2019 | 15.2 |
| 19/08/2019 | 16.3 |
| 19/08/2019 | 32.5 |
| 19/08/2019 | 28 |
| 19/08/2019 | 35.3 |
| 19/08/2019 | 32.6 |
| 19/08/2019 | 31.7 |
| 19/08/2019 | 26.4 |
| 19/08/2019 | 23 |
| 19/08/2019 | 27.4 |
| 19/08/2019 | 27.3 |
| 19/08/2019 | 32 |
| 19/08/2019 | 31.7 |
| 19/08/2019 | 33.3 |
| 19/08/2019 | 32.1 |
| 19/08/2019 | 28.4 |
| 19/08/2019 | 32.4 |
| 19/08/2019 | 57.5 |
| 19/08/2019 | 36.9 |
| 19/08/2019 | 28.2 |
| 20/08/2019 | 28.4 |
| 20/08/2019 | 23.7 |
| 20/08/2019 | 21.7 |
| 20/08/2019 | 17.4 |
| 20/08/2019 | 15 |
| 20/08/2019 | 16.3 |
| 20/08/2019 | 18 |
| 20/08/2019 | 15.6 |
| 20/08/2019 | 18.5 |
| 20/08/2019 | 24.2 |
| 20/08/2019 | 22.5 |
| 20/08/2019 | 25.8 |
| 20/08/2019 | 24.6 |
| 20/08/2019 | 26.5 |
| 20/08/2019 | 28.2 |
| 20/08/2019 | 27.1 |
| 20/08/2019 | 36.1 |
| 20/08/2019 | 37.4 |
| 20/08/2019 | 34.6 |
| 20/08/2019 | 50.6 |
| 20/08/2019 | 185.6 |
| 20/08/2019 | 150.9 |
| 20/08/2019 | 114.5 |
| 20/08/2019 | 100.1 |
| 21/08/2019 | 70.7 |
| 21/08/2019 | 51.2 |
| 21/08/2019 | 47.3 |
| 21/08/2019 | 40.7 |
| 21/08/2019 | 35.6 |
| 21/08/2019 | 36.5 |
| 21/08/2019 | 45 |
| 21/08/2019 | 51.9 |
| 21/08/2019 | 57.9 |
| 21/08/2019 | 46.5 |
| 21/08/2019 | 43.2 |
| 21/08/2019 | 31 |
| 21/08/2019 | 39.1 |
| 21/08/2019 | 42.8 |
| 21/08/2019 | 38.9 |
| 21/08/2019 | 37.1 |
| 21/08/2019 | 51.1 |
| 21/08/2019 | 59.1 |
| 21/08/2019 | 51.2 |
| 21/08/2019 | 74.6 |
| 21/08/2019 | 92 |
| 21/08/2019 | 66 |
| 21/08/2019 | 59.5 |
| 21/08/2019 | 63.4 |
| 22/08/2019 | 42.2 |
| 22/08/2019 | 41.2 |
| 22/08/2019 | 40.2 |
| 22/08/2019 | 31.8 |
| 22/08/2019 | 21.2 |
| 22/08/2019 | 19.4 |
| 22/08/2019 | 22 |
| 22/08/2019 | 25 |
| 22/08/2019 | 32 |
| 22/08/2019 | 35.4 |
| 22/08/2019 | 42.6 |
| 22/08/2019 | 46.2 |
| 22/08/2019 | 48.7 |
| 22/08/2019 | 49.2 |
| 22/08/2019 | 49.7 |
| 22/08/2019 | 47.2 |
| 22/08/2019 | 54.2 |
| 22/08/2019 | 46.7 |
| 22/08/2019 | 46.5 |
| 22/08/2019 | 47.1 |
| 22/08/2019 | 53.1 |
| 22/08/2019 | 51.5 |
| 22/08/2019 | 45.2 |
| 22/08/2019 | 40.2 |
| 23/08/2019 | 35.5 |
| 23/08/2019 | 29.5 |
| 23/08/2019 | 27.1 |
| 23/08/2019 | 25.4 |
| 23/08/2019 | 23.2 |
| 23/08/2019 | 22.2 |
| 23/08/2019 | 30.2 |
| 23/08/2019 | 29 |
| 23/08/2019 | 23.8 |
| 23/08/2019 | 27.5 |
| 23/08/2019 | 27.7 |
| 23/08/2019 | 34.6 |
| 23/08/2019 | 32.7 |
| 23/08/2019 | 30.9 |
| 23/08/2019 | 29.8 |
| 23/08/2019 | 39.4 |
| 23/08/2019 | 30.9 |
| 23/08/2019 | 32.9 |
| 23/08/2019 | 42.3 |
| 23/08/2019 | 30.6 |
| 23/08/2019 | 27.3 |
| 23/08/2019 | 21.2 |
| 23/08/2019 | 20.2 |
| 23/08/2019 | 27.5 |
| 24/08/2019 | 21 |
| 24/08/2019 | 19 |
| 24/08/2019 | 18.5 |
| 24/08/2019 | 20.4 |
| 24/08/2019 | 20.4 |
| 24/08/2019 | 18.2 |
| 24/08/2019 | 20 |
| 24/08/2019 | 19 |
| 24/08/2019 | 18.1 |
| 24/08/2019 | 16.3 |
| 24/08/2019 | 14.3 |
| 24/08/2019 | 7.6 |
| 24/08/2019 | 7.8 |
| 24/08/2019 | 8.4 |
| 24/08/2019 | 11.1 |
| 24/08/2019 | 11.2 |
| 24/08/2019 | 11.2 |
| 24/08/2019 | 18 |
| 24/08/2019 | 15.9 |
| 24/08/2019 | 14.2 |
| 24/08/2019 | 23.6 |
| 24/08/2019 | 16.9 |
| 24/08/2019 | 9.5 |
| 24/08/2019 | 11.1 |
| 25/08/2019 | 12.4 |
| 25/08/2019 | 10.5 |
| 25/08/2019 | 11.4 |
| 25/08/2019 | 10.4 |
| 25/08/2019 | 11.2 |
| 25/08/2019 | 14.4 |
| 25/08/2019 | 15.7 |
| 25/08/2019 | 13.5 |
| 25/08/2019 | 14.8 |
| 25/08/2019 | 14 |
| 25/08/2019 | 13.6 |
| 25/08/2019 | 14.7 |
| 25/08/2019 | 10.2 |
| 25/08/2019 | 10.9 |
| 25/08/2019 | 11.1 |
| 25/08/2019 | 13.5 |
| 25/08/2019 | 13.7 |
| 25/08/2019 | 11.2 |
| 25/08/2019 | 12.3 |
| 25/08/2019 | 10.3 |
| 25/08/2019 | 11.1 |
| 25/08/2019 | 9.4 |
| 25/08/2019 | 9.1 |
| 25/08/2019 | 12.2 |
| 26/08/2019 | 9.5 |
| 26/08/2019 | 9.8 |
| 26/08/2019 | 8 |
| 26/08/2019 | 8.1 |
| 26/08/2019 | 8.2 |
| 26/08/2019 | 6 |
| 26/08/2019 | 7.4 |
| 26/08/2019 | 8.5 |
| 26/08/2019 | 14.8 |
| 26/08/2019 | 12.8 |
| 26/08/2019 | 17.4 |
| 26/08/2019 | 19.4 |
| 26/08/2019 | 17.9 |
| 26/08/2019 | 17.9 |
| 26/08/2019 | 18.5 |
| 26/08/2019 | 23.6 |
| 26/08/2019 | 18.4 |
| 26/08/2019 | 19.6 |
| 26/08/2019 | 23.1 |
| 26/08/2019 | 29.4 |
| 26/08/2019 | 25.2 |
| 26/08/2019 | 31.6 |
| 26/08/2019 | 27.4 |
| 26/08/2019 | 19.9 |
| 27/08/2019 | 17.6 |
| 27/08/2019 | 14 |
| 27/08/2019 | 15.2 |
| 27/08/2019 | 16.5 |
| 27/08/2019 | 14.5 |
| 27/08/2019 | 14.2 |
| 27/08/2019 | 13.8 |
| 27/08/2019 | 14.4 |
| 27/08/2019 | 12.6 |
| 27/08/2019 | 14.8 |
| 27/08/2019 | 14.5 |
| 27/08/2019 | 12.6 |
| 27/08/2019 | 11.4 |
| 27/08/2019 | 12 |
| 27/08/2019 | 9.3 |
| 27/08/2019 | 9.8 |
| 27/08/2019 | 12 |
| 27/08/2019 | 15.4 |
| 27/08/2019 | 12 |
| 27/08/2019 | 11.3 |
| 27/08/2019 | 16.4 |
| 27/08/2019 | 25 |
| 27/08/2019 | 11.2 |
| 27/08/2019 | 12.3 |
| 28/08/2019 | 10.9 |
| 28/08/2019 | 9.4 |
| 28/08/2019 | 9 |
| 28/08/2019 | 8.6 |
| 28/08/2019 | 10.4 |
| 28/08/2019 | 12 |
| 28/08/2019 | 12.7 |
| 28/08/2019 | 14.8 |
| 28/08/2019 | 14.3 |
| 28/08/2019 | 14.5 |
| 28/08/2019 | 17.7 |
| 28/08/2019 | 17.2 |
| 28/08/2019 | 18.6 |
| 28/08/2019 | 26.8 |
| 28/08/2019 | 22.6 |
| 28/08/2019 | 25.9 |
| 28/08/2019 | 36.6 |
| 28/08/2019 | 61 |
| 28/08/2019 | 18.9 |
| 28/08/2019 | 16.7 |
| 28/08/2019 | 34.6 |
| 28/08/2019 | 37.5 |
| 28/08/2019 | 39.8 |
| 28/08/2019 | 24.8 |
| 29/08/2019 | 24.8 |
| 29/08/2019 | 23.6 |
| 29/08/2019 | 18.2 |
| 29/08/2019 | 17 |
| 29/08/2019 | 15.2 |
| 29/08/2019 | 14.1 |
| 29/08/2019 | 13.5 |
| 29/08/2019 | 17 |
| 29/08/2019 | 20.1 |
| 29/08/2019 | 17.7 |
| 29/08/2019 | 13.3 |
| 29/08/2019 | 15.3 |
| 29/08/2019 | 16.8 |
| 29/08/2019 | 16.5 |
| 29/08/2019 | 17.8 |
| 29/08/2019 | 22 |
| 29/08/2019 | 22.6 |
| 29/08/2019 | 23 |
| 29/08/2019 | 30 |
| 29/08/2019 | 26.6 |
| 29/08/2019 | 41.5 |
| 29/08/2019 | 45.3 |
| 29/08/2019 | 52.3 |
| 29/08/2019 | 74.9 |
| 30/08/2019 | 70.3 |
| 30/08/2019 | 86.1 |
| 30/08/2019 | 66 |
| 30/08/2019 | 70.7 |
| 30/08/2019 | 53.1 |
| 30/08/2019 | 58.7 |
| 30/08/2019 | 50 |
| 30/08/2019 | 69.6 |
| 30/08/2019 | 75.1 |
| 30/08/2019 | 64.7 |
| 30/08/2019 | 60.1 |
| 30/08/2019 | 34 |
| 30/08/2019 | 41.3 |
| 30/08/2019 | 25 |
| 30/08/2019 | 20.1 |
| 30/08/2019 | 36.5 |
| 30/08/2019 | 36.9 |
| 30/08/2019 | 59 |
| 30/08/2019 | 44.2 |
| 30/08/2019 | 77.8 |
| 30/08/2019 | 42.2 |
| 30/08/2019 | 36.7 |
| 30/08/2019 | 43.5 |
| 30/08/2019 | 33.2 |
| 31/08/2019 | 23.1 |
| 31/08/2019 | 23.2 |
| 31/08/2019 | 31 |
| 31/08/2019 | 29.3 |
| 31/08/2019 | 31.2 |
| 31/08/2019 | 25.1 |
| 31/08/2019 | 21.8 |
| 31/08/2019 | 25.4 |
| 31/08/2019 | 29.1 |
| 31/08/2019 | 28.2 |
| 31/08/2019 | 17.1 |
| 31/08/2019 | 17.2 |
| 31/08/2019 | 17 |
| 31/08/2019 | 19.6 |
| 31/08/2019 | 20.1 |
| 31/08/2019 | 33.6 |
| 31/08/2019 | 30.8 |
| 31/08/2019 | 30.2 |
| 31/08/2019 | 49.5 |
| 31/08/2019 | 51.1 |
| 31/08/2019 | 55.7 |
| 31/08/2019 | 34.2 |
| 31/08/2019 | 27.4 |
| 31/08/2019 | 28.7 |